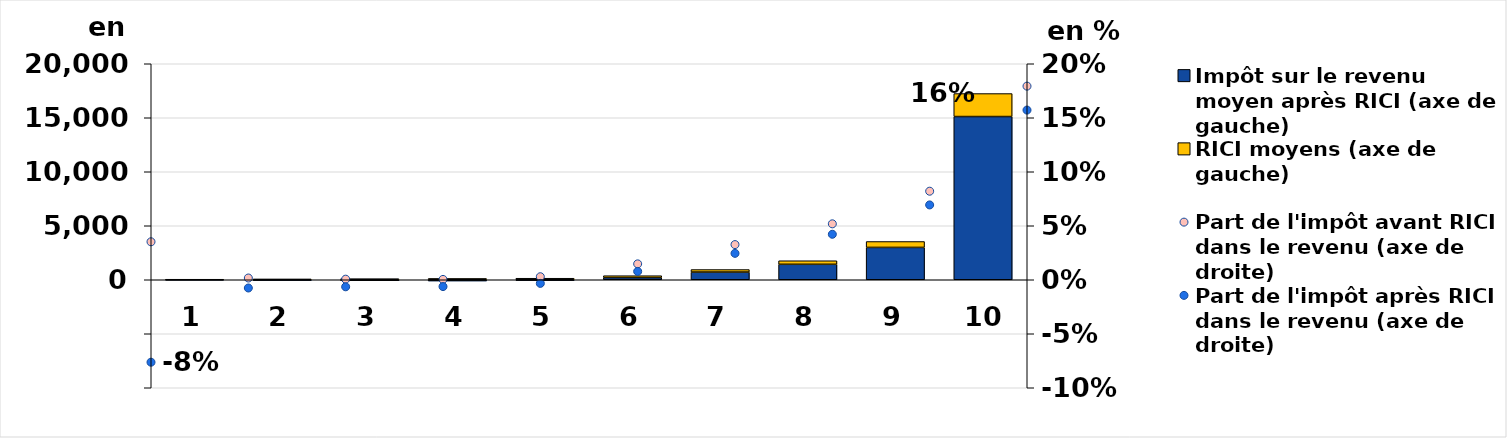
| Category | Impôt sur le revenu moyen après RICI (axe de gauche) | RICI moyens (axe de gauche) |
|---|---|---|
| 0 | -33 | 48 |
| 1 | -62 | 78 |
| 2 | -92 | 103 |
| 3 | -113 | 123 |
| 4 | -72 | 141 |
| 5 | 200 | 176 |
| 6 | 711 | 234 |
| 7 | 1432 | 328 |
| 8 | 2994 | 547 |
| 9 | 15112 | 2129 |